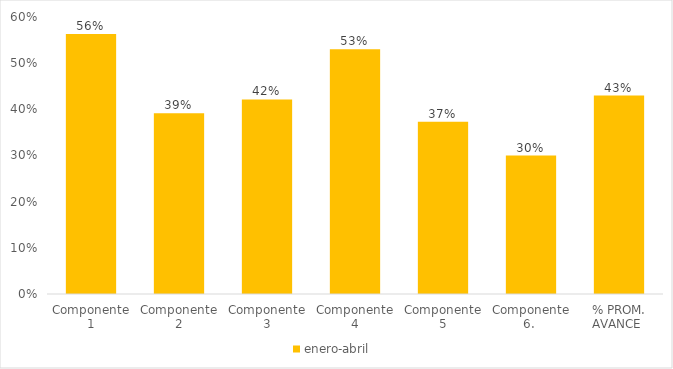
| Category | enero-abril  | mayo - agosto  | septiembre-diciembre |
|---|---|---|---|
| Componente 1 | 0.563 |  |  |
| Componente 2 | 0.392 |  |  |
| Componente 3 | 0.421 |  |  |
| Componente 4 | 0.53 |  |  |
| Componente 5 | 0.373 |  |  |
| Componente 6.  | 0.3 |  |  |
| % PROM. AVANCE  | 0.43 |  |  |